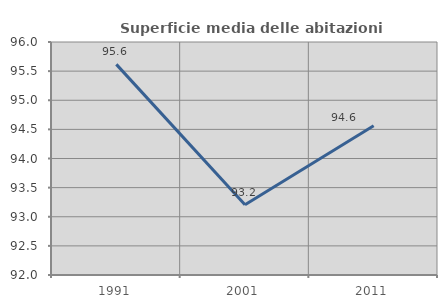
| Category | Superficie media delle abitazioni occupate |
|---|---|
| 1991.0 | 95.616 |
| 2001.0 | 93.206 |
| 2011.0 | 94.564 |